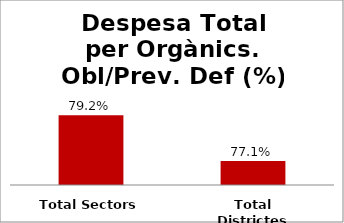
| Category | Series 0 |
|---|---|
| Total Sectors | 0.792 |
| Total Districtes | 0.771 |